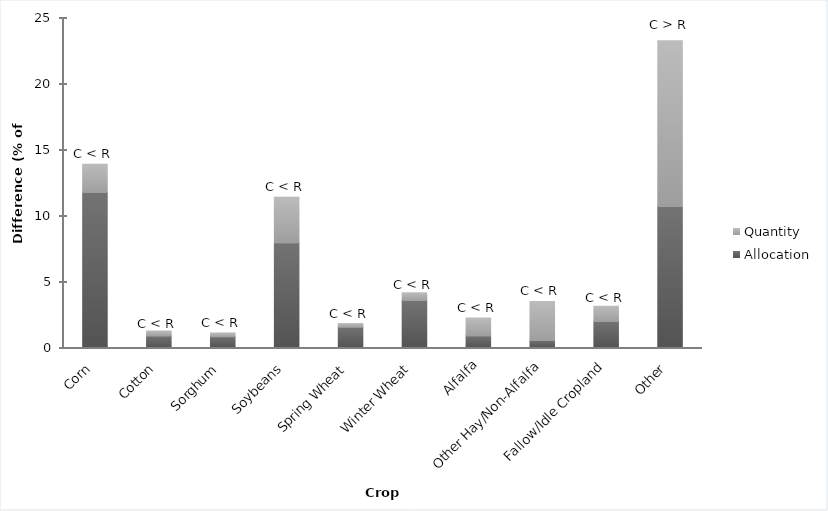
| Category | Allocation | Quantity |
|---|---|---|
| Corn | 11.818 | 2.137 |
| Cotton | 0.944 | 0.384 |
| Sorghum | 0.897 | 0.269 |
| Soybeans | 8.013 | 3.45 |
| Spring Wheat | 1.606 | 0.281 |
| Winter Wheat | 3.635 | 0.585 |
| Alfalfa | 0.963 | 1.337 |
| Other Hay/Non-Alfalfa | 0.597 | 2.96 |
| Fallow/Idle Cropland | 2.047 | 1.147 |
| Other | 10.759 | 12.551 |